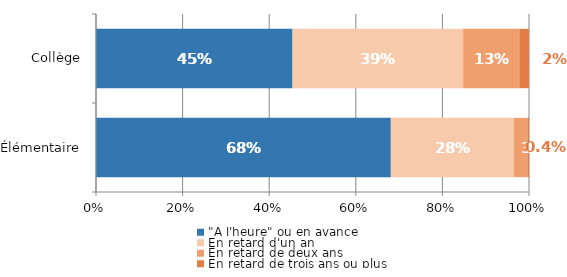
| Category | "A l'heure" ou en avance | En retard d'un an | En retard de deux ans | En retard de trois ans ou plus |
|---|---|---|---|---|
| Élémentaire | 0.681 | 0.284 | 0.032 | 0.004 |
| Collège | 0.454 | 0.394 | 0.13 | 0.022 |